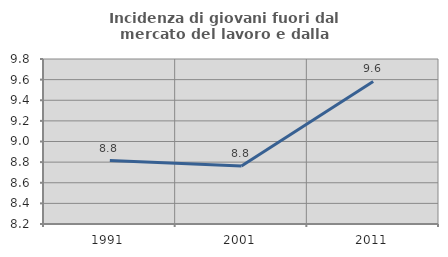
| Category | Incidenza di giovani fuori dal mercato del lavoro e dalla formazione  |
|---|---|
| 1991.0 | 8.815 |
| 2001.0 | 8.762 |
| 2011.0 | 9.583 |